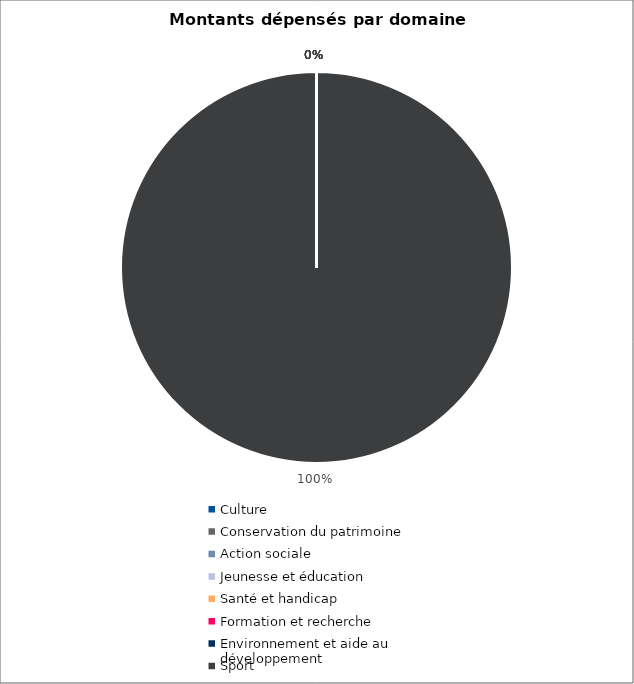
| Category | Series 0 |
|---|---|
| Culture | 0 |
| Conservation du patrimoine | 0 |
| Action sociale | 0 |
| Jeunesse et éducation | 0 |
| Santé et handicap | 0 |
| Formation et recherche | 0 |
| Environnement et aide au
développement | 0 |
| Sport | 5918517 |
| Autres projets d’utilité publique | 0 |